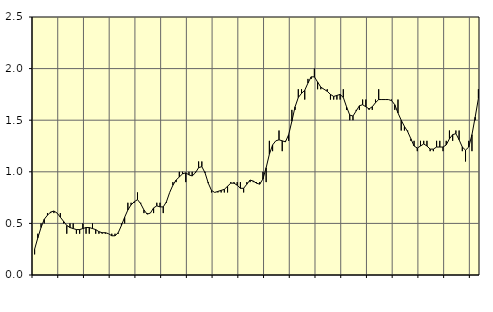
| Category | Piggar | Sysselsatta utomlands1 |
|---|---|---|
| nan | 0.2 | 0.25 |
| 87.0 | 0.4 | 0.36 |
| 87.0 | 0.5 | 0.46 |
| 87.0 | 0.5 | 0.54 |
| nan | 0.6 | 0.58 |
| 88.0 | 0.6 | 0.61 |
| 88.0 | 0.6 | 0.62 |
| 88.0 | 0.6 | 0.6 |
| nan | 0.6 | 0.56 |
| 89.0 | 0.5 | 0.52 |
| 89.0 | 0.4 | 0.48 |
| 89.0 | 0.5 | 0.46 |
| nan | 0.5 | 0.45 |
| 90.0 | 0.4 | 0.44 |
| 90.0 | 0.4 | 0.44 |
| 90.0 | 0.5 | 0.45 |
| nan | 0.4 | 0.46 |
| 91.0 | 0.4 | 0.46 |
| 91.0 | 0.5 | 0.45 |
| 91.0 | 0.4 | 0.44 |
| nan | 0.4 | 0.42 |
| 92.0 | 0.4 | 0.41 |
| 92.0 | 0.4 | 0.41 |
| 92.0 | 0.4 | 0.4 |
| nan | 0.4 | 0.38 |
| 93.0 | 0.4 | 0.38 |
| 93.0 | 0.4 | 0.41 |
| 93.0 | 0.5 | 0.48 |
| nan | 0.5 | 0.56 |
| 94.0 | 0.7 | 0.63 |
| 94.0 | 0.7 | 0.68 |
| 94.0 | 0.7 | 0.71 |
| nan | 0.8 | 0.73 |
| 95.0 | 0.7 | 0.69 |
| 95.0 | 0.6 | 0.63 |
| 95.0 | 0.6 | 0.59 |
| nan | 0.6 | 0.6 |
| 96.0 | 0.6 | 0.65 |
| 96.0 | 0.7 | 0.67 |
| 96.0 | 0.7 | 0.66 |
| nan | 0.6 | 0.66 |
| 97.0 | 0.7 | 0.71 |
| 97.0 | 0.8 | 0.8 |
| 97.0 | 0.9 | 0.87 |
| nan | 0.9 | 0.92 |
| 98.0 | 1 | 0.95 |
| 98.0 | 1 | 0.98 |
| 98.0 | 0.9 | 0.99 |
| nan | 1 | 0.97 |
| 99.0 | 1 | 0.96 |
| 99.0 | 1 | 0.99 |
| 99.0 | 1.1 | 1.04 |
| nan | 1.1 | 1.05 |
| 0.0 | 1 | 0.99 |
| 0.0 | 0.9 | 0.89 |
| 0.0 | 0.8 | 0.82 |
| nan | 0.8 | 0.8 |
| 1.0 | 0.8 | 0.81 |
| 1.0 | 0.8 | 0.82 |
| 1.0 | 0.8 | 0.83 |
| nan | 0.8 | 0.86 |
| 2.0 | 0.9 | 0.89 |
| 2.0 | 0.9 | 0.89 |
| 2.0 | 0.9 | 0.87 |
| nan | 0.9 | 0.84 |
| 3.0 | 0.8 | 0.84 |
| 3.0 | 0.9 | 0.88 |
| 3.0 | 0.9 | 0.92 |
| nan | 0.9 | 0.91 |
| 4.0 | 0.9 | 0.89 |
| 4.0 | 0.9 | 0.88 |
| 4.0 | 1 | 0.93 |
| nan | 0.9 | 1.04 |
| 5.0 | 1.3 | 1.17 |
| 5.0 | 1.2 | 1.26 |
| 5.0 | 1.3 | 1.3 |
| nan | 1.4 | 1.31 |
| 6.0 | 1.2 | 1.3 |
| 6.0 | 1.3 | 1.29 |
| 6.0 | 1.3 | 1.36 |
| nan | 1.6 | 1.49 |
| 7.0 | 1.6 | 1.63 |
| 7.0 | 1.8 | 1.72 |
| 7.0 | 1.8 | 1.76 |
| nan | 1.7 | 1.79 |
| 8.0 | 1.9 | 1.86 |
| 8.0 | 1.9 | 1.92 |
| 8.0 | 2 | 1.92 |
| nan | 1.8 | 1.87 |
| 9.0 | 1.8 | 1.82 |
| 9.0 | 1.8 | 1.8 |
| 9.0 | 1.8 | 1.78 |
| nan | 1.7 | 1.75 |
| 10.0 | 1.7 | 1.73 |
| 10.0 | 1.7 | 1.74 |
| 10.0 | 1.7 | 1.75 |
| nan | 1.8 | 1.72 |
| 11.0 | 1.6 | 1.63 |
| 11.0 | 1.5 | 1.55 |
| 11.0 | 1.5 | 1.54 |
| nan | 1.6 | 1.59 |
| 12.0 | 1.6 | 1.64 |
| 12.0 | 1.7 | 1.65 |
| 12.0 | 1.7 | 1.63 |
| nan | 1.6 | 1.61 |
| 13.0 | 1.6 | 1.63 |
| 13.0 | 1.7 | 1.67 |
| 13.0 | 1.8 | 1.7 |
| nan | 1.7 | 1.7 |
| 14.0 | 1.7 | 1.7 |
| 14.0 | 1.7 | 1.7 |
| 14.0 | 1.7 | 1.69 |
| nan | 1.6 | 1.65 |
| 15.0 | 1.7 | 1.57 |
| 15.0 | 1.4 | 1.5 |
| 15.0 | 1.4 | 1.44 |
| nan | 1.4 | 1.39 |
| 16.0 | 1.3 | 1.32 |
| 16.0 | 1.3 | 1.25 |
| 16.0 | 1.2 | 1.23 |
| nan | 1.3 | 1.25 |
| 17.0 | 1.3 | 1.27 |
| 17.0 | 1.3 | 1.25 |
| 17.0 | 1.2 | 1.22 |
| nan | 1.2 | 1.22 |
| 18.0 | 1.3 | 1.24 |
| 18.0 | 1.3 | 1.24 |
| 18.0 | 1.2 | 1.24 |
| nan | 1.3 | 1.26 |
| 19.0 | 1.4 | 1.32 |
| 19.0 | 1.3 | 1.36 |
| 19.0 | 1.4 | 1.37 |
| nan | 1.4 | 1.31 |
| 20.0 | 1.2 | 1.24 |
| 20.0 | 1.1 | 1.21 |
| 20.0 | 1.3 | 1.24 |
| nan | 1.2 | 1.36 |
| 21.0 | 1.5 | 1.53 |
| 21.0 | 1.8 | 1.71 |